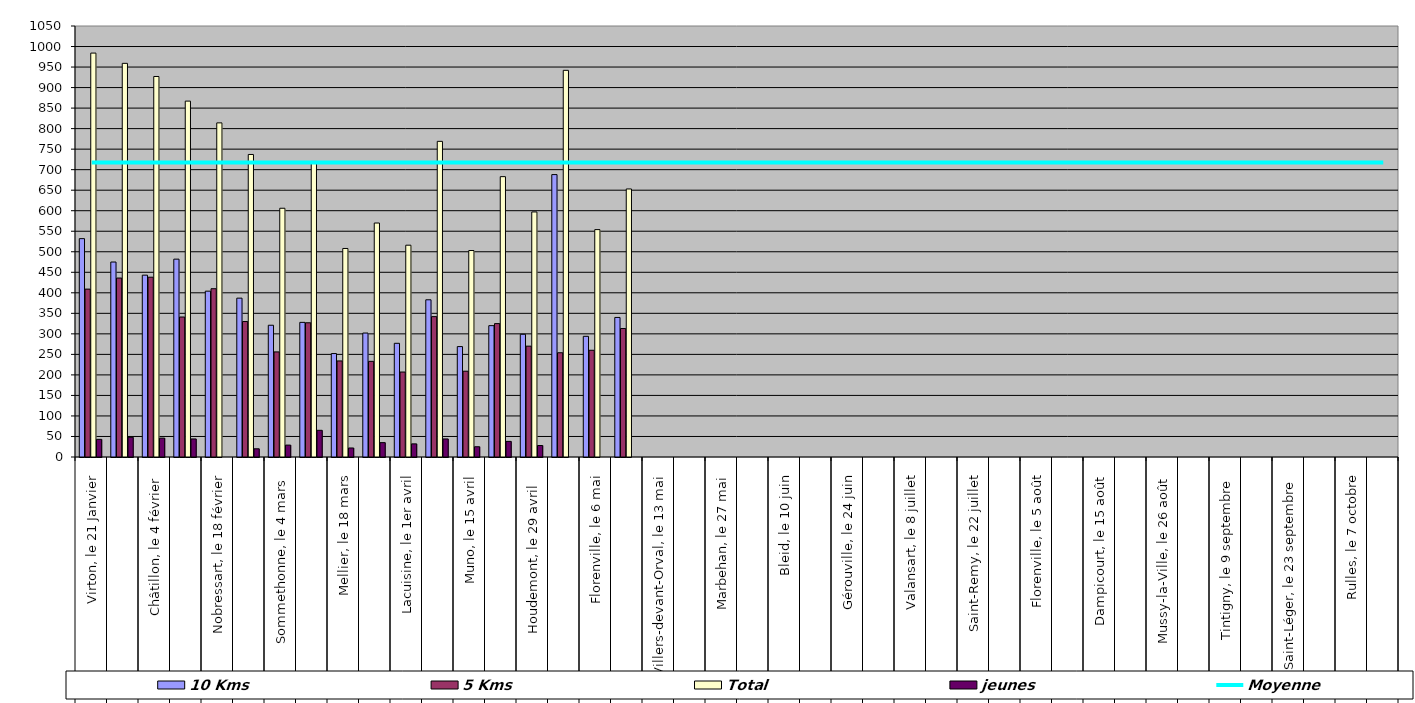
| Category | 10 Kms | 5 Kms | Total | jeunes |
|---|---|---|---|---|
| 0 | 532 | 409 | 984 | 43 |
| 1 | 475 | 436 | 959 | 48 |
| 2 | 443 | 438 | 927 | 46 |
| 3 | 482 | 341 | 867 | 44 |
| 4 | 404 | 410 | 814 | 0 |
| 5 | 387 | 330 | 737 | 20 |
| 6 | 321 | 256 | 606 | 29 |
| 7 | 328 | 327 | 720 | 65 |
| 8 | 252 | 234 | 508 | 22 |
| 9 | 302 | 233 | 570 | 35 |
| 10 | 277 | 207 | 516 | 32 |
| 11 | 383 | 342 | 769 | 44 |
| 12 | 269 | 209 | 503 | 25 |
| 13 | 320 | 325 | 683 | 38 |
| 14 | 299 | 270 | 597 | 28 |
| 15 | 688 | 254 | 942 | 0 |
| 16 | 294 | 260 | 554 | 0 |
| 17 | 340 | 313 | 653 | 0 |
| 18 | 0 | 0 | 0 | 0 |
| 19 | 0 | 0 | 0 | 0 |
| 20 | 0 | 0 | 0 | 0 |
| 21 | 0 | 0 | 0 | 0 |
| 22 | 0 | 0 | 0 | 0 |
| 23 | 0 | 0 | 0 | 0 |
| 24 | 0 | 0 | 0 | 0 |
| 25 | 0 | 0 | 0 | 0 |
| 26 | 0 | 0 | 0 | 0 |
| 27 | 0 | 0 | 0 | 0 |
| 28 | 0 | 0 | 0 | 0 |
| 29 | 0 | 0 | 0 | 0 |
| 30 | 0 | 0 | 0 | 0 |
| 31 | 0 | 0 | 0 | 0 |
| 32 | 0 | 0 | 0 | 0 |
| 33 | 0 | 0 | 0 | 0 |
| 34 | 0 | 0 | 0 | 0 |
| 35 | 0 | 0 | 0 | 0 |
| 36 | 0 | 0 | 0 | 0 |
| 37 | 0 | 0 | 0 | 0 |
| 38 | 0 | 0 | 0 | 0 |
| 39 | 0 | 0 | 0 | 0 |
| 40 | 0 | 0 | 0 | 0 |
| 41 | 0 | 0 | 0 | 0 |